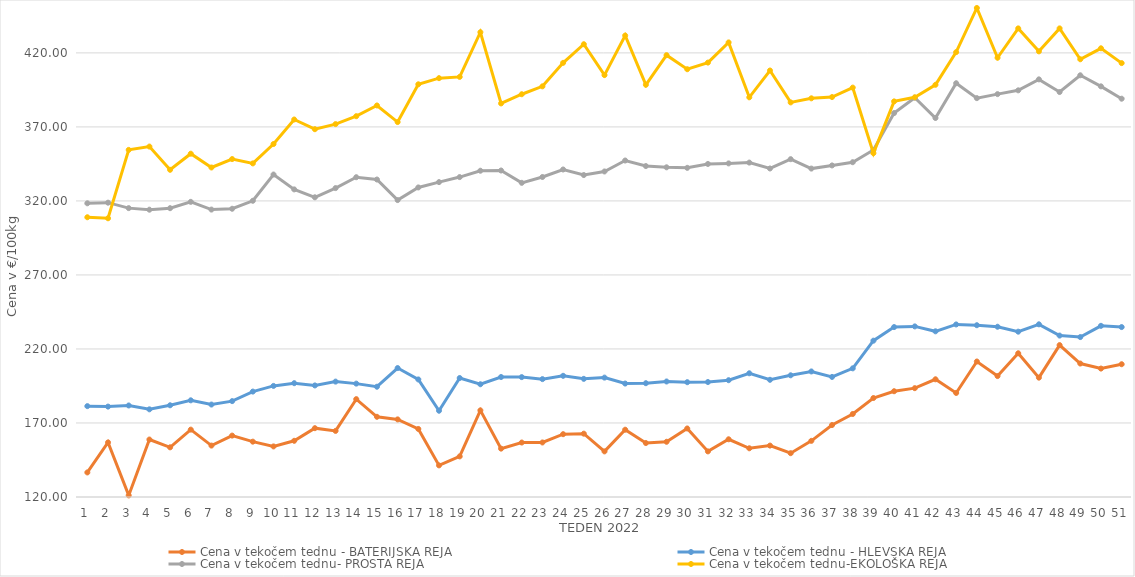
| Category | Cena v tekočem tednu - BATERIJSKA REJA | Cena v tekočem tednu - HLEVSKA REJA | Cena v tekočem tednu- PROSTA REJA | Cena v tekočem tednu-EKOLOŠKA REJA |
|---|---|---|---|---|
| 1.0 | 136.59 | 181.38 | 318.4 | 308.97 |
| 2.0 | 156.88 | 181.07 | 318.82 | 308.28 |
| 3.0 | 121.07 | 181.83 | 315.14 | 354.48 |
| 4.0 | 158.82 | 179.22 | 314.08 | 356.72 |
| 5.0 | 153.55 | 181.96 | 315.1 | 341.03 |
| 6.0 | 165.51 | 185.31 | 319.38 | 351.9 |
| 7.0 | 154.74 | 182.45 | 314.16 | 342.59 |
| 8.0 | 161.48 | 184.77 | 314.71 | 348.28 |
| 9.0 | 157.38 | 191.21 | 320.1 | 345.35 |
| 10.0 | 154.16 | 195.04 | 337.83 | 358.45 |
| 11.0 | 157.96 | 196.88 | 327.79 | 375 |
| 12.0 | 166.49 | 195.36 | 322.46 | 368.45 |
| 13.0 | 164.66 | 197.95 | 328.67 | 371.9 |
| 14.0 | 186.11 | 196.59 | 336.02 | 377.24 |
| 15.0 | 174.18 | 194.49 | 334.46 | 384.48 |
| 16.0 | 172.42 | 207.1 | 320.58 | 373.28 |
| 17.0 | 165.96 | 199.41 | 329.11 | 398.79 |
| 18.0 | 141.36 | 178.29 | 332.71 | 402.93 |
| 19.0 | 147.43 | 200.37 | 336.11 | 403.79 |
| 20.0 | 178.51 | 196.16 | 340.4 | 433.97 |
| 21.0 | 152.67 | 201.05 | 340.55 | 385.86 |
| 22.0 | 156.8 | 200.98 | 332.23 | 392.07 |
| 23.0 | 156.84 | 199.63 | 336.16 | 397.41 |
| 24.0 | 162.44 | 201.86 | 341.24 | 413.28 |
| 25.0 | 162.78 | 199.81 | 337.48 | 425.86 |
| 26.0 | 150.82 | 200.65 | 339.9 | 405 |
| 27.0 | 165.45 | 196.64 | 347.3 | 431.72 |
| 28.0 | 156.46 | 196.88 | 343.56 | 398.45 |
| 29.0 | 157.31 | 198.03 | 342.71 | 418.45 |
| 30.0 | 166.29 | 197.55 | 342.35 | 408.97 |
| 31.0 | 150.81 | 197.66 | 344.97 | 413.45 |
| 32.0 | 158.99 | 198.9 | 345.35 | 427.07 |
| 33.0 | 152.91 | 203.57 | 345.9 | 390 |
| 34.0 | 154.73 | 199.17 | 341.92 | 408.1 |
| 35.0 | 149.6 | 202.21 | 348.2 | 386.55 |
| 36.0 | 157.93 | 204.81 | 341.85 | 389.31 |
| 37.0 | 168.61 | 201.11 | 343.97 | 390.17 |
| 38.0 | 176.07 | 206.91 | 346.16 | 396.55 |
| 39.0 | 186.86 | 225.6 | 354.41 | 352.24 |
| 40.0 | 191.45 | 234.79 | 379.35 | 387.24 |
| 41.0 | 193.52 | 235.24 | 389.75 | 390 |
| 42.0 | 199.51 | 231.92 | 376.02 | 398.45 |
| 43.0 | 190.28 | 236.56 | 399.51 | 420.52 |
| 44.0 | 211.53 | 236.04 | 389.44 | 450.35 |
| 45.0 | 201.69 | 235.01 | 392.15 | 416.72 |
| 46.0 | 217.08 | 231.68 | 394.71 | 436.55 |
| 47.0 | 200.62 | 236.65 | 402.12 | 421.03 |
| 48.0 | 222.61 | 229.05 | 393.56 | 436.55 |
| 49.0 | 210.16 | 228.03 | 404.87 | 415.69 |
| 50.0 | 206.76 | 235.63 | 397.4 | 423.1 |
| 51.0 | 209.69 | 234.79 | 389.05 | 413.1 |